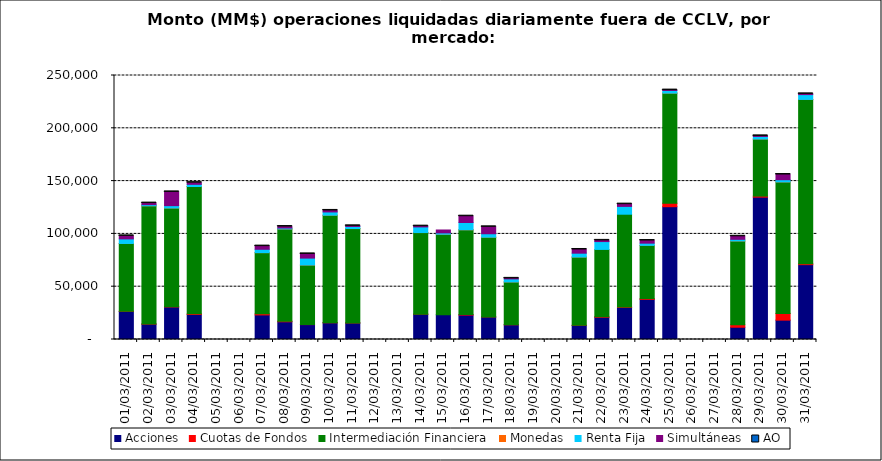
| Category | Acciones | Cuotas de Fondos | Intermediación Financiera | Monedas | Renta Fija | Simultáneas | AO |
|---|---|---|---|---|---|---|---|
| 01/03/2011 | 26570.181 | 207.81 | 64162.403 | 2.265 | 4332.016 | 2849.578 | 0.75 |
| 02/03/2011 | 14522.406 | 240.344 | 111843.514 | 5.06 | 1096.066 | 1436.862 | 0.07 |
| 03/03/2011 | 30785.006 | 336.077 | 93390.748 | 10.304 | 2217.701 | 13013.519 | 2.532 |
| 04/03/2011 | 23701 | 566.043 | 120618.456 | 10.011 | 2043.9 | 1577.084 | 4.307 |
| 07/03/2011 | 23278.857 | 1086.039 | 57879.295 | 4.113 | 3184.002 | 2987.655 | 0.01 |
| 08/03/2011 | 16776.446 | 540.114 | 87358.524 | 29.697 | 884.682 | 1346.031 | 0.238 |
| 09/03/2011 | 14092.445 | 170.086 | 56259.562 | 30.972 | 6533.76 | 3963.194 | 0.395 |
| 10/03/2011 | 15849.508 | 101.595 | 101740.681 | 6.395 | 3096.739 | 1413.7 | 0.103 |
| 11/03/2011 | 15645.822 | 87.093 | 89331.646 | 15.04 | 1970.916 | 566.323 | 0.24 |
| 14/03/2011 | 23932.212 | 82.88 | 77254.018 | 7.694 | 5343.299 | 696.733 | 0.123 |
| 15/03/2011 | 23481.46 | 0 | 76181.99 | 15.985 | 1284.685 | 2727.88 | 0 |
| 16/03/2011 | 23141.541 | 415.621 | 80337.801 | 7.28 | 6874.085 | 5979.119 | 0.017 |
| 17/03/2011 | 21366.117 | 39.694 | 75457.469 | 15.018 | 3254.757 | 6547.736 | 0.354 |
| 18/03/2011 | 13930.033 | 78.775 | 40483.882 | 0.46 | 2895.456 | 488.072 | 0.012 |
| 21/03/2011 | 13368.939 | 45.965 | 64658.355 | 6.758 | 3661.778 | 3489.448 | 0.106 |
| 22/03/2011 | 21029.823 | 484.65 | 63793.391 | 0 | 7421.581 | 1113.843 | 0.454 |
| 23/03/2011 | 30364.388 | 504.511 | 87776.233 | 0 | 7389.08 | 2146.052 | 0.035 |
| 24/03/2011 | 37994.354 | 732.477 | 50387.987 | 9.9 | 2097.395 | 2492.947 | 0.051 |
| 25/03/2011 | 125749.284 | 3295.966 | 104265.387 | 3.15 | 2519.641 | 323.421 | 0.131 |
| 28/03/2011 | 11619.929 | 2287.848 | 79402.009 | 9.45 | 1547.169 | 2870.761 | 0.212 |
| 29/03/2011 | 134801.288 | 996.755 | 54043.546 | 8.55 | 2429.053 | 518.52 | 0.468 |
| 30/03/2011 | 18320.778 | 6395.879 | 124481.255 | 24.083 | 2088.784 | 4905.436 | 0.113 |
| 31/03/2011 | 70886.943 | 939.094 | 155484.46 | 37.799 | 4563.245 | 686.254 | 0.095 |